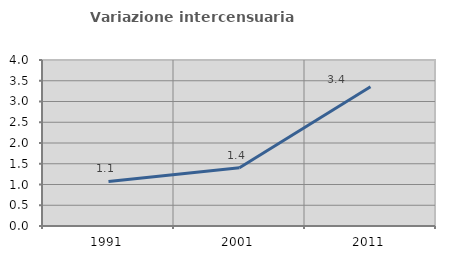
| Category | Variazione intercensuaria annua |
|---|---|
| 1991.0 | 1.074 |
| 2001.0 | 1.405 |
| 2011.0 | 3.354 |